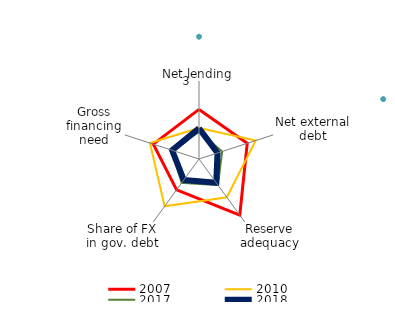
| Category | 2007 | 2008 | 2010 | 2017 | 2018 |
|---|---|---|---|---|---|
| Net lending | 0.814 |  | -0.613 | -0.92 | -0.639 |
| Net external debt | 0.901 |  | 1.591 | -1.128 | -1.501 |
| Reserve adequacy | 2.337 |  | 0.644 | -0.522 | -0.744 |
| Share of FX in gov. debt | -0.071 |  | 1.498 | -0.728 | -1.005 |
| Gross financing need | 0.694 |  | 0.97 | -0.798 | -0.826 |